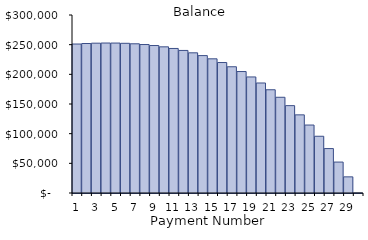
| Category | Balance |
|---|---|
| 1.0 | 251096.805 |
| 2.0 | 251942.322 |
| 3.0 | 252512.4 |
| 4.0 | 252781.066 |
| 5.0 | 252720.395 |
| 6.0 | 252300.369 |
| 7.0 | 251488.733 |
| 8.0 | 250250.829 |
| 9.0 | 248549.43 |
| 10.0 | 246344.553 |
| 11.0 | 243593.268 |
| 12.0 | 240249.485 |
| 13.0 | 236263.732 |
| 14.0 | 231582.911 |
| 15.0 | 226150.047 |
| 16.0 | 219904.009 |
| 17.0 | 212779.217 |
| 18.0 | 204705.329 |
| 19.0 | 195606.9 |
| 20.0 | 185403.025 |
| 21.0 | 174006.952 |
| 22.0 | 161325.667 |
| 23.0 | 147259.457 |
| 24.0 | 131701.433 |
| 25.0 | 114537.023 |
| 26.0 | 95643.434 |
| 27.0 | 74889.07 |
| 28.0 | 52132.913 |
| 29.0 | 27223.857 |
| 30.0 | 0 |